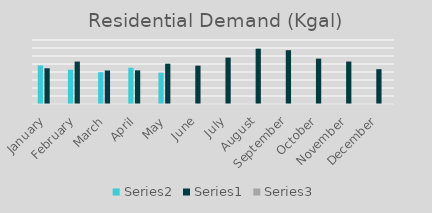
| Category | Series 1 | Series 0 | Series 2 |
|---|---|---|---|
| January | 48220 | 44639 | 1.08 |
| February | 42842.474 | 53057 | 0.807 |
| March | 39765.159 | 41882 | 0.949 |
| April | 45340.468 | 42057.867 | 1.078 |
| May | 39237.233 | 50377.601 | 0.779 |
| June | 0 | 47943.133 | 0 |
| July | 0 | 58007.249 | 0 |
| August | 0 | 69155.328 | 0 |
| September | 0 | 67226.815 | 0 |
| October | 0 | 56697.11 | 0 |
| November | 0 | 53097.198 | 0 |
| December | 0 | 43519.04 | 0 |